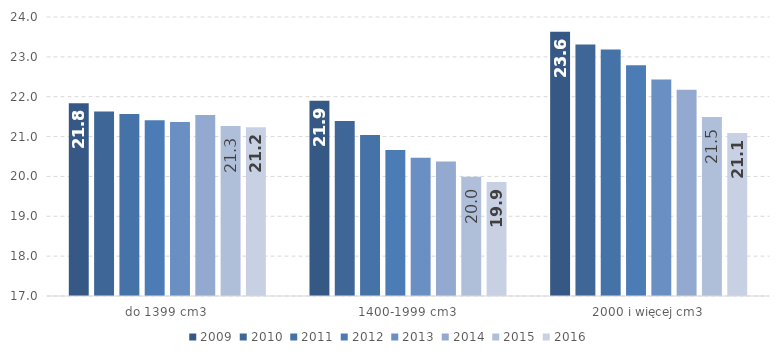
| Category | 2009 | 2010 | 2011 | 2012 | 2013 | 2014 | 2015 | 2016 |
|---|---|---|---|---|---|---|---|---|
| do 1399 cm3 | 21.838 | 21.631 | 21.567 | 21.411 | 21.363 | 21.544 | 21.267 | 21.234 |
| 1400-1999 cm3 | 21.9 | 21.389 | 21.042 | 20.66 | 20.467 | 20.372 | 19.993 | 19.863 |
| 2000 i więcej cm3 | 23.629 | 23.31 | 23.186 | 22.791 | 22.431 | 22.176 | 21.494 | 21.088 |